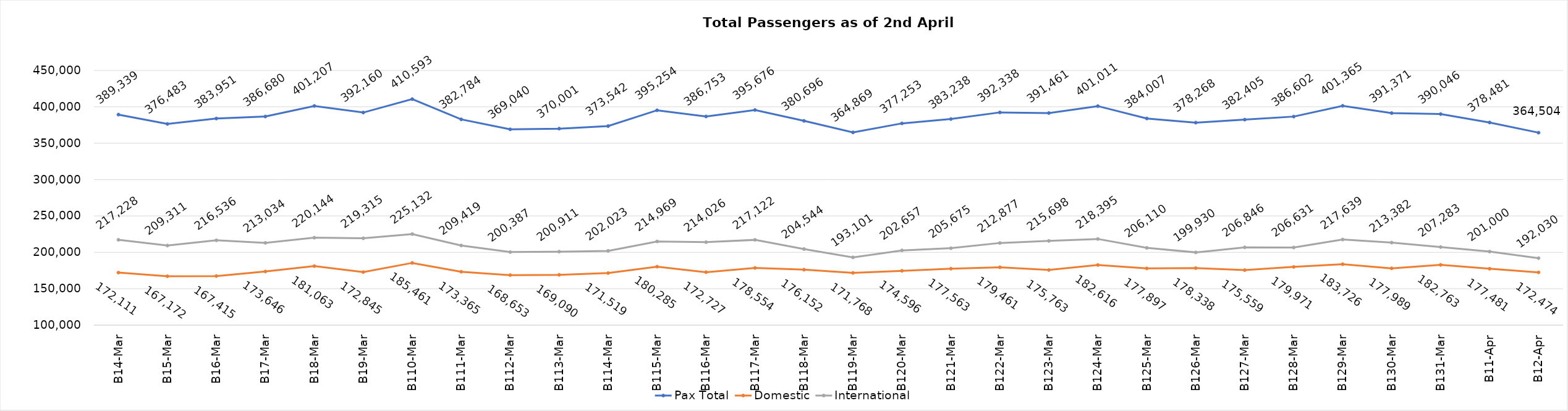
| Category | Pax Total | Domestic | International |
|---|---|---|---|
| 2024-03-04 | 389339 | 172111 | 217228 |
| 2024-03-05 | 376483 | 167172 | 209311 |
| 2024-03-06 | 383951 | 167415 | 216536 |
| 2024-03-07 | 386680 | 173646 | 213034 |
| 2024-03-08 | 401207 | 181063 | 220144 |
| 2024-03-09 | 392160 | 172845 | 219315 |
| 2024-03-10 | 410593 | 185461 | 225132 |
| 2024-03-11 | 382784 | 173365 | 209419 |
| 2024-03-12 | 369040 | 168653 | 200387 |
| 2024-03-13 | 370001 | 169090 | 200911 |
| 2024-03-14 | 373542 | 171519 | 202023 |
| 2024-03-15 | 395254 | 180285 | 214969 |
| 2024-03-16 | 386753 | 172727 | 214026 |
| 2024-03-17 | 395676 | 178554 | 217122 |
| 2024-03-18 | 380696 | 176152 | 204544 |
| 2024-03-19 | 364869 | 171768 | 193101 |
| 2024-03-20 | 377253 | 174596 | 202657 |
| 2024-03-21 | 383238 | 177563 | 205675 |
| 2024-03-22 | 392338 | 179461 | 212877 |
| 2024-03-23 | 391461 | 175763 | 215698 |
| 2024-03-24 | 401011 | 182616 | 218395 |
| 2024-03-25 | 384007 | 177897 | 206110 |
| 2024-03-26 | 378268 | 178338 | 199930 |
| 2024-03-27 | 382405 | 175559 | 206846 |
| 2024-03-28 | 386602 | 179971 | 206631 |
| 2024-03-29 | 401365 | 183726 | 217639 |
| 2024-03-30 | 391371 | 177989 | 213382 |
| 2024-03-31 | 390046 | 182763 | 207283 |
| 2024-04-01 | 378481 | 177481 | 201000 |
| 2024-04-02 | 364504 | 172474 | 192030 |